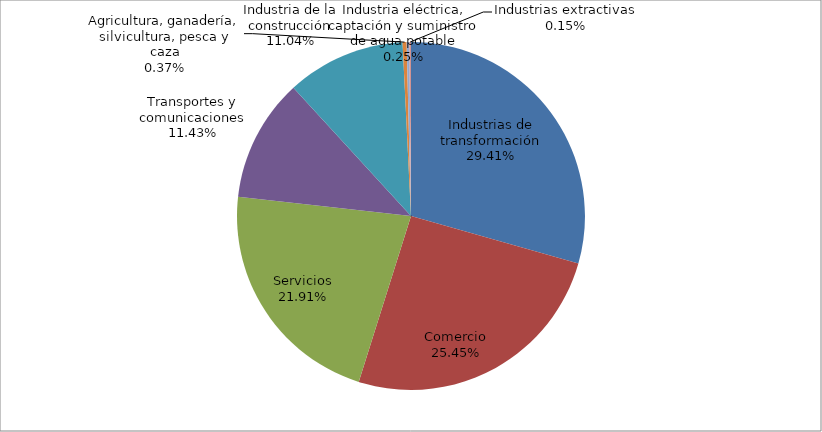
| Category | Series 0 |
|---|---|
| Industrias de transformación | 29704 |
| Comercio | 25701 |
| Servicios | 22124 |
| Transportes y comunicaciones | 11538 |
| Industria de la construcción | 11147 |
| Agricultura, ganadería, silvicultura, pesca y caza | 376 |
| Industria eléctrica, captación y suministro de agua potable | 251 |
| Industrias extractivas | 155 |